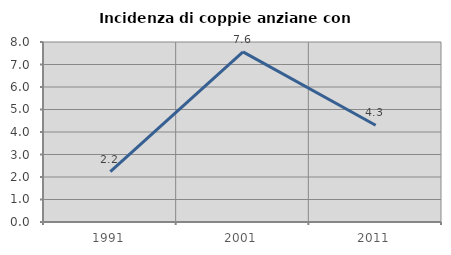
| Category | Incidenza di coppie anziane con figli |
|---|---|
| 1991.0 | 2.239 |
| 2001.0 | 7.563 |
| 2011.0 | 4.301 |